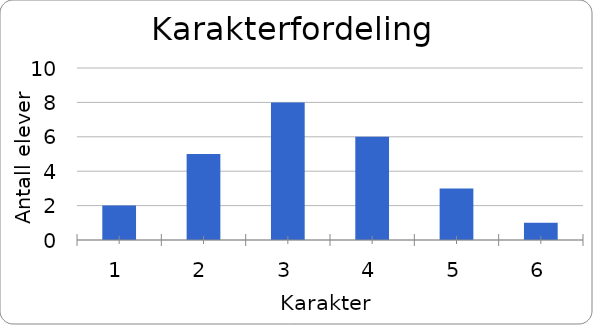
| Category | Antall elever |
|---|---|
| 1.0 | 2 |
| 2.0 | 5 |
| 3.0 | 8 |
| 4.0 | 6 |
| 5.0 | 3 |
| 6.0 | 1 |